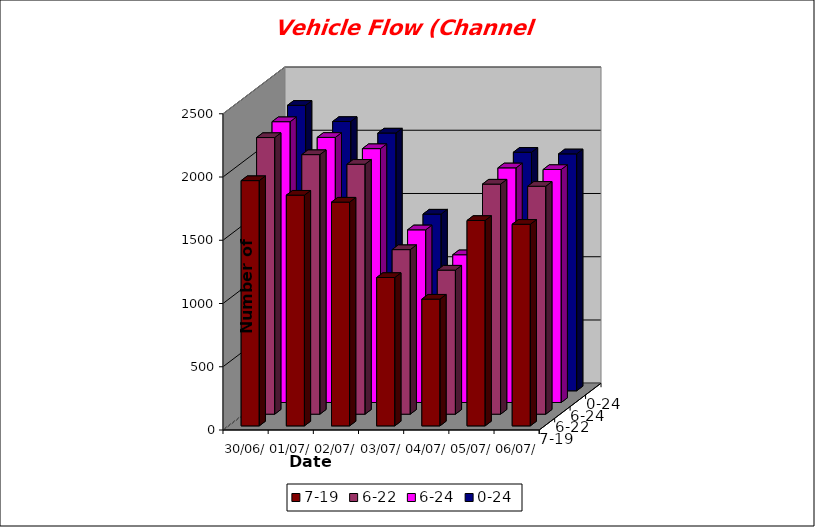
| Category | 7-19 | 6-22 | 6-24 | 0-24 |
|---|---|---|---|---|
| 30/06/2021 | 1939 | 2187 | 2220 | 2257 |
| 01/07/2021 | 1824 | 2052 | 2096 | 2129 |
| 02/07/2021 | 1769 | 1976 | 2007 | 2038 |
| 03/07/2021 | 1173 | 1301 | 1365 | 1397 |
| 04/07/2021 | 1002 | 1139 | 1168 | 1211 |
| 05/07/2021 | 1624 | 1819 | 1855 | 1886 |
| 06/07/2021 | 1594 | 1802 | 1842 | 1873 |